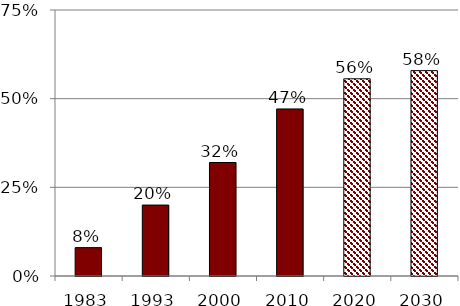
| Category | Series 0 |
|---|---|
| 1983.0 | 0.08 |
| 1993.0 | 0.2 |
| 2000.0 | 0.32 |
| 2010.0 | 0.471 |
| 2020.0 | 0.556 |
| 2030.0 | 0.579 |